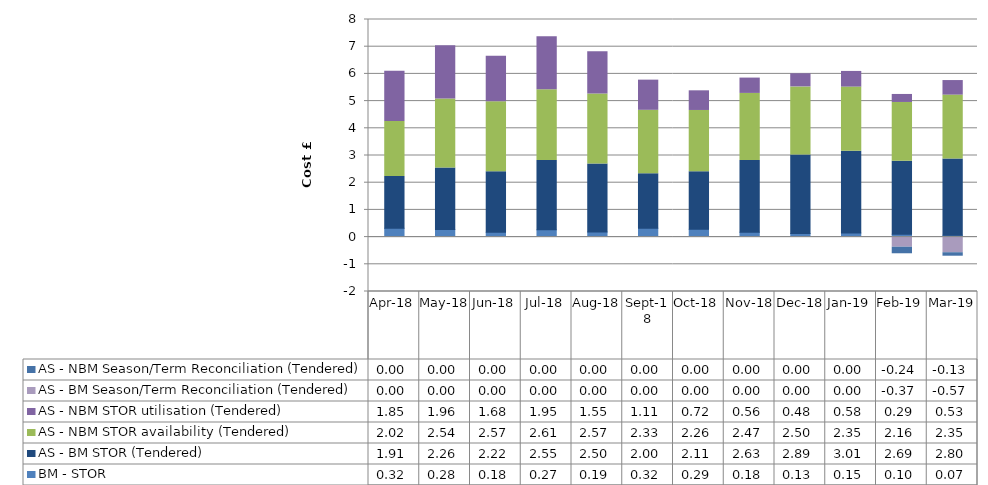
| Category | BM - STOR | AS - BM STOR (Tendered) | AS - NBM STOR availability (Tendered) | AS - NBM STOR utilisation (Tendered) | AS - BM Season/Term Reconciliation (Tendered) | AS - NBM Season/Term Reconciliation (Tendered) |
|---|---|---|---|---|---|---|
| 2018-04-30 | 0.323 | 1.908 | 2.017 | 1.848 | 0 | 0 |
| 2018-05-31 | 0.276 | 2.261 | 2.543 | 1.959 | 0 | 0 |
| 2018-06-30 | 0.175 | 2.223 | 2.573 | 1.677 | 0 | 0 |
| 2018-07-31 | 0.266 | 2.547 | 2.607 | 1.948 | 0 | 0 |
| 2018-08-31 | 0.19 | 2.5 | 2.573 | 1.548 | 0 | 0 |
| 2018-09-30 | 0.325 | 2.003 | 2.334 | 1.109 | 0 | 0 |
| 2018-10-31 | 0.285 | 2.114 | 2.256 | 0.723 | 0 | 0 |
| 2018-11-30 | 0.178 | 2.635 | 2.469 | 0.564 | 0 | 0 |
| 2018-12-31 | 0.132 | 2.886 | 2.504 | 0.482 | 0 | 0 |
| 2019-01-31 | 0.151 | 3.01 | 2.355 | 0.575 | 0 | 0 |
| 2019-02-28 | 0.105 | 2.686 | 2.159 | 0.294 | -0.372 | -0.241 |
| 2019-03-31 | 0.069 | 2.804 | 2.347 | 0.535 | -0.575 | -0.128 |